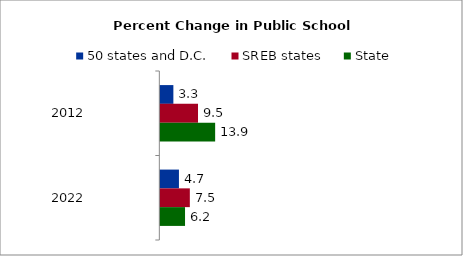
| Category | 50 states and D.C. | SREB states | State |
|---|---|---|---|
| 2012.0 | 3.296 | 9.525 | 13.858 |
| 2022.0 | 4.705 | 7.458 | 6.245 |